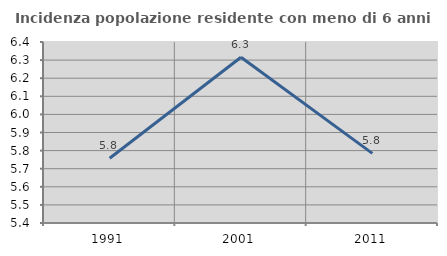
| Category | Incidenza popolazione residente con meno di 6 anni |
|---|---|
| 1991.0 | 5.758 |
| 2001.0 | 6.316 |
| 2011.0 | 5.785 |